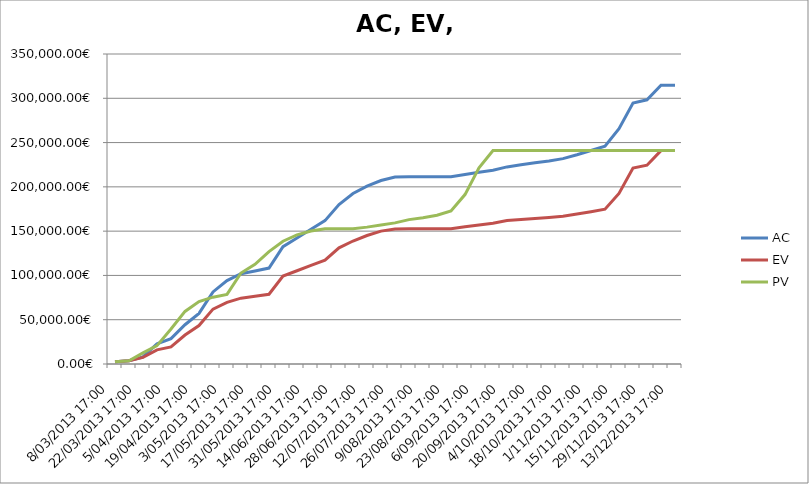
| Category | AC | EV | PV |
|---|---|---|---|
| 8/03/2013 17:00 | 2490 | 2490 | 2490 |
| 15/03/2013 17:00 | 3700 | 3700 | 3700 |
| 22/03/2013 17:00 | 8020 | 7440.187 | 12566.667 |
| 29/03/2013 17:00 | 22796.667 | 16009.907 | 20780 |
| 5/04/2013 17:00 | 28663.334 | 19299.627 | 39580 |
| 12/04/2013 17:00 | 44343.334 | 32664.179 | 59380 |
| 19/04/2013 17:00 | 57143.334 | 43362.687 | 70434 |
| 26/04/2013 17:00 | 81347.334 | 61942.34 | 75430 |
| 3/05/2013 17:00 | 94147.334 | 69567.873 | 78630 |
| 10/05/2013 17:00 | 101907.334 | 74342 | 102770 |
| 17/05/2013 17:00 | 105107.334 | 76536.286 | 112570 |
| 24/05/2013 17:00 | 108307.334 | 78730.572 | 126860 |
| 31/05/2013 17:00 | 132447.334 | 99318.696 | 138652.572 |
| 7/06/2013 17:00 | 142247.334 | 105283.913 | 145880.001 |
| 14/06/2013 17:00 | 152047.334 | 111249.132 | 150088.001 |
| 21/06/2013 17:00 | 161847.334 | 117214.348 | 152680.001 |
| 28/06/2013 17:00 | 179961.905 | 131140.897 | 152680.001 |
| 5/07/2013 17:00 | 192499.048 | 138861.27 | 152680.001 |
| 12/07/2013 17:00 | 200847.049 | 145101.887 | 154540.001 |
| 19/07/2013 17:00 | 207175.049 | 150056.272 | 156940.001 |
| 26/07/2013 17:00 | 211175.049 | 152496.95 | 159340.001 |
| 2/08/2013 17:00 | 211475.049 | 152680.001 | 162997.001 |
| 9/08/2013 17:00 | 211475.049 | 152680.001 | 165037.001 |
| 16/08/2013 17:00 | 211475.049 | 152680.001 | 167917.001 |
| 23/08/2013 17:00 | 211475.049 | 152680.001 | 172717.001 |
| 30/08/2013 17:00 | 214061.715 | 154856.057 | 191277.001 |
| 6/09/2013 17:00 | 216461.715 | 156884.226 | 221408.429 |
| 13/09/2013 17:00 | 218861.715 | 158912.395 | 240915.001 |
| 20/09/2013 17:00 | 222518.715 | 161898.539 | 241015.001 |
| 27/09/2013 17:00 | 224918.715 | 163129.308 | 241015.001 |
| 4/10/2013 17:00 | 227318.715 | 164360.078 | 241015.001 |
| 11/10/2013 17:00 | 229278.715 | 165373.843 | 241015.001 |
| 18/10/2013 17:00 | 231838.715 | 166721.211 | 241015.001 |
| 25/10/2013 17:00 | 236246.715 | 169236.137 | 241015.001 |
| 1/11/2013 17:00 | 241046.715 | 171998.727 | 241015.001 |
| 8/11/2013 17:00 | 245846.715 | 174761.317 | 241015.001 |
| 15/11/2013 17:00 | 265726.715 | 192565.422 | 241015.001 |
| 22/11/2013 17:00 | 294735.287 | 221193.364 | 241015.001 |
| 29/11/2013 17:00 | 298256.144 | 224415.001 | 241015.001 |
| 6/12/2013 17:00 | 314756.144 | 240915.001 | 241015.001 |
| 13/12/2013 17:00 | 314856.144 | 241015.001 | 241015.001 |